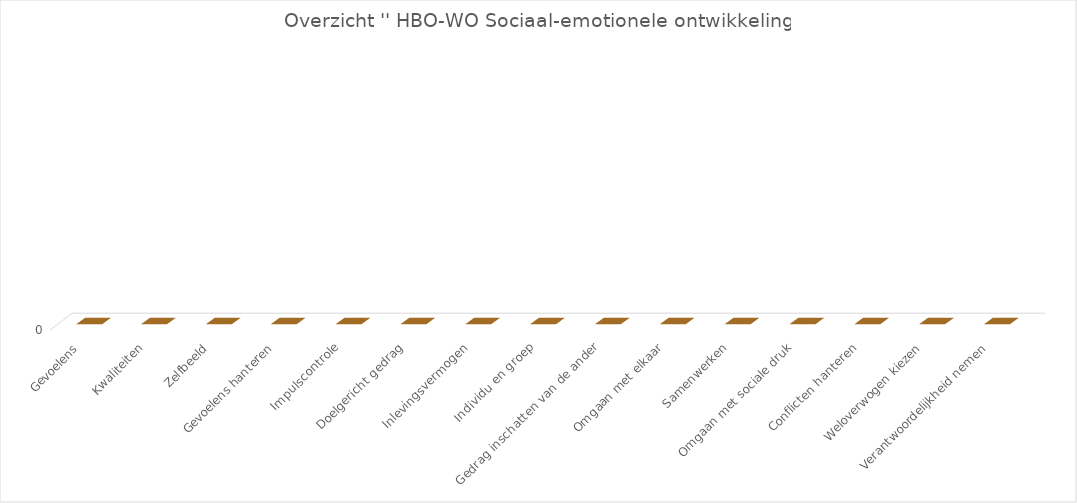
| Category | Series 2 |
|---|---|
| Gevoelens | 0 |
| Kwaliteiten | 0 |
| Zelfbeeld | 0 |
| Gevoelens hanteren | 0 |
| Impulscontrole | 0 |
| Doelgericht gedrag | 0 |
| Inlevingsvermogen | 0 |
| Individu en groep | 0 |
| Gedrag inschatten van de ander | 0 |
| Omgaan met elkaar | 0 |
| Samenwerken | 0 |
| Omgaan met sociale druk | 0 |
| Conflicten hanteren | 0 |
| Weloverwogen kiezen | 0 |
| Verantwoordelijkheid nemen | 0 |